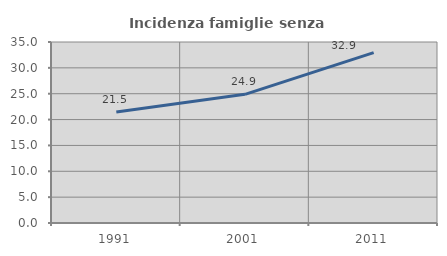
| Category | Incidenza famiglie senza nuclei |
|---|---|
| 1991.0 | 21.474 |
| 2001.0 | 24.878 |
| 2011.0 | 32.939 |